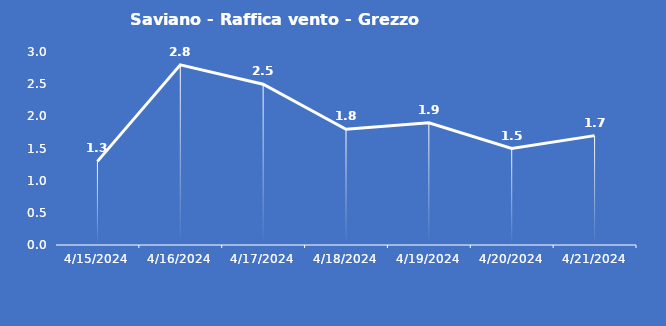
| Category | Saviano - Raffica vento - Grezzo (m/s) |
|---|---|
| 4/15/24 | 1.3 |
| 4/16/24 | 2.8 |
| 4/17/24 | 2.5 |
| 4/18/24 | 1.8 |
| 4/19/24 | 1.9 |
| 4/20/24 | 1.5 |
| 4/21/24 | 1.7 |